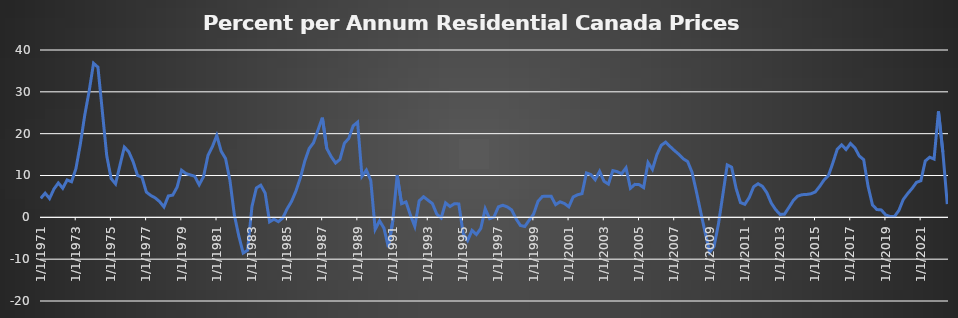
| Category | value |
|---|---|
| 1/1/71 | 4.536 |
| 4/1/71 | 5.773 |
| 7/1/71 | 4.499 |
| 10/1/71 | 6.759 |
| 1/1/72 | 8.218 |
| 4/1/72 | 6.953 |
| 7/1/72 | 8.937 |
| 10/1/72 | 8.504 |
| 1/1/73 | 11.665 |
| 4/1/73 | 17.497 |
| 7/1/73 | 24.431 |
| 10/1/73 | 30.149 |
| 1/1/74 | 36.834 |
| 4/1/74 | 35.884 |
| 7/1/74 | 25.313 |
| 10/1/74 | 14.725 |
| 1/1/75 | 9.264 |
| 4/1/75 | 7.991 |
| 7/1/75 | 12.442 |
| 10/1/75 | 16.782 |
| 1/1/76 | 15.684 |
| 4/1/76 | 13.284 |
| 7/1/76 | 10.007 |
| 10/1/76 | 9.613 |
| 1/1/77 | 6.04 |
| 4/1/77 | 5.226 |
| 7/1/77 | 4.657 |
| 10/1/77 | 3.771 |
| 1/1/78 | 2.492 |
| 4/1/78 | 5.114 |
| 7/1/78 | 5.31 |
| 10/1/78 | 7.24 |
| 1/1/79 | 11.259 |
| 4/1/79 | 10.461 |
| 7/1/79 | 10.141 |
| 10/1/79 | 9.817 |
| 1/1/80 | 7.778 |
| 4/1/80 | 9.75 |
| 7/1/80 | 14.783 |
| 10/1/80 | 16.875 |
| 1/1/81 | 19.575 |
| 4/1/81 | 15.797 |
| 7/1/81 | 14.06 |
| 10/1/81 | 8.801 |
| 1/1/82 | 0.545 |
| 4/1/82 | -4.407 |
| 7/1/82 | -8.537 |
| 10/1/82 | -7.878 |
| 1/1/83 | 2.59 |
| 4/1/83 | 7.02 |
| 7/1/83 | 7.689 |
| 10/1/83 | 5.791 |
| 1/1/84 | -1.076 |
| 4/1/84 | -0.45 |
| 7/1/84 | -1.031 |
| 10/1/84 | -0.158 |
| 1/1/85 | 2.038 |
| 4/1/85 | 3.816 |
| 7/1/85 | 6.293 |
| 10/1/85 | 9.442 |
| 1/1/86 | 13.435 |
| 4/1/86 | 16.446 |
| 7/1/86 | 17.854 |
| 10/1/86 | 20.854 |
| 1/1/87 | 23.825 |
| 4/1/87 | 16.466 |
| 7/1/87 | 14.51 |
| 10/1/87 | 12.99 |
| 1/1/88 | 13.858 |
| 4/1/88 | 17.7 |
| 7/1/88 | 18.874 |
| 10/1/88 | 21.868 |
| 1/1/89 | 22.742 |
| 4/1/89 | 9.816 |
| 7/1/89 | 11.294 |
| 10/1/89 | 8.814 |
| 1/1/90 | -2.884 |
| 4/1/90 | -0.832 |
| 7/1/90 | -2.598 |
| 10/1/90 | -7.131 |
| 1/1/91 | -0.875 |
| 4/1/91 | 10.005 |
| 7/1/91 | 3.263 |
| 10/1/91 | 3.678 |
| 1/1/92 | 0.544 |
| 4/1/92 | -2.15 |
| 7/1/92 | 3.937 |
| 10/1/92 | 4.917 |
| 1/1/93 | 4.092 |
| 4/1/93 | 3.291 |
| 7/1/93 | 0.768 |
| 10/1/93 | -0.148 |
| 1/1/94 | 3.451 |
| 4/1/94 | 2.588 |
| 7/1/94 | 3.248 |
| 10/1/94 | 3.208 |
| 1/1/95 | -3.895 |
| 4/1/95 | -5.552 |
| 7/1/95 | -3.116 |
| 10/1/95 | -4.106 |
| 1/1/96 | -2.642 |
| 4/1/96 | 2.044 |
| 7/1/96 | -0.321 |
| 10/1/96 | 0.09 |
| 1/1/97 | 2.512 |
| 4/1/97 | 2.885 |
| 7/1/97 | 2.503 |
| 10/1/97 | 1.789 |
| 1/1/98 | -0.336 |
| 4/1/98 | -1.947 |
| 7/1/98 | -2.187 |
| 10/1/98 | -0.668 |
| 1/1/99 | 0.773 |
| 4/1/99 | 3.823 |
| 7/1/99 | 5.004 |
| 10/1/99 | 5.032 |
| 1/1/00 | 5.017 |
| 4/1/00 | 3.029 |
| 7/1/00 | 3.715 |
| 10/1/00 | 3.304 |
| 1/1/01 | 2.52 |
| 4/1/01 | 4.879 |
| 7/1/01 | 5.396 |
| 10/1/01 | 5.667 |
| 1/1/02 | 10.608 |
| 4/1/02 | 10.223 |
| 7/1/02 | 8.989 |
| 10/1/02 | 10.994 |
| 1/1/03 | 8.616 |
| 4/1/03 | 7.948 |
| 7/1/03 | 11.174 |
| 10/1/03 | 10.915 |
| 1/1/04 | 10.419 |
| 4/1/04 | 11.839 |
| 7/1/04 | 6.943 |
| 10/1/04 | 7.88 |
| 1/1/05 | 7.82 |
| 4/1/05 | 7.106 |
| 7/1/05 | 13.093 |
| 10/1/05 | 11.455 |
| 1/1/06 | 14.947 |
| 4/1/06 | 17.21 |
| 7/1/06 | 17.978 |
| 10/1/06 | 16.944 |
| 1/1/07 | 15.968 |
| 4/1/07 | 15.065 |
| 7/1/07 | 13.991 |
| 10/1/07 | 13.338 |
| 1/1/08 | 10.783 |
| 4/1/08 | 6.104 |
| 7/1/08 | 1.119 |
| 10/1/08 | -3.711 |
| 1/1/09 | -8.368 |
| 4/1/09 | -6.964 |
| 7/1/09 | -1.616 |
| 10/1/09 | 5.389 |
| 1/1/10 | 12.531 |
| 4/1/10 | 11.987 |
| 7/1/10 | 6.979 |
| 10/1/10 | 3.529 |
| 1/1/11 | 3.115 |
| 4/1/11 | 4.738 |
| 7/1/11 | 7.308 |
| 10/1/11 | 8.025 |
| 1/1/12 | 7.413 |
| 4/1/12 | 5.888 |
| 7/1/12 | 3.422 |
| 10/1/12 | 1.841 |
| 1/1/13 | 0.692 |
| 4/1/13 | 0.739 |
| 7/1/13 | 2.332 |
| 10/1/13 | 4.003 |
| 1/1/14 | 5.07 |
| 4/1/14 | 5.415 |
| 7/1/14 | 5.462 |
| 10/1/14 | 5.628 |
| 1/1/15 | 6.063 |
| 4/1/15 | 7.395 |
| 7/1/15 | 8.934 |
| 10/1/15 | 9.994 |
| 1/1/16 | 12.993 |
| 4/1/16 | 16.284 |
| 7/1/16 | 17.332 |
| 10/1/16 | 16.22 |
| 1/1/17 | 17.645 |
| 4/1/17 | 16.636 |
| 7/1/17 | 14.671 |
| 10/1/17 | 13.793 |
| 1/1/18 | 7.442 |
| 4/1/18 | 2.976 |
| 7/1/18 | 1.861 |
| 10/1/18 | 1.768 |
| 1/1/19 | 0.585 |
| 4/1/19 | 0.193 |
| 7/1/19 | 0.192 |
| 10/1/19 | 1.641 |
| 1/1/20 | 4.268 |
| 4/1/20 | 5.673 |
| 7/1/20 | 6.91 |
| 10/1/20 | 8.357 |
| 1/1/21 | 8.744 |
| 4/1/21 | 13.467 |
| 7/1/21 | 14.363 |
| 10/1/21 | 13.935 |
| 1/1/22 | 25.327 |
| 4/1/22 | 15.579 |
| 7/1/22 | 3.174 |